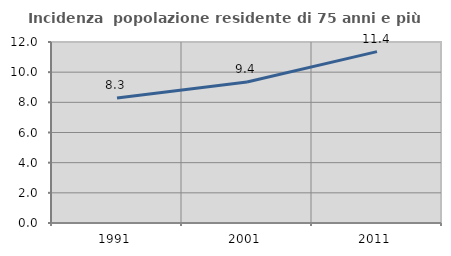
| Category | Incidenza  popolazione residente di 75 anni e più |
|---|---|
| 1991.0 | 8.295 |
| 2001.0 | 9.352 |
| 2011.0 | 11.363 |